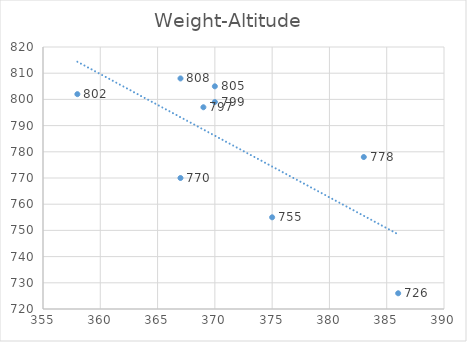
| Category | Series 0 |
|---|---|
| 383.0 | 778 |
| 369.0 | 797 |
| 370.0 | 799 |
| 370.0 | 805 |
| 375.0 | 755 |
| 367.0 | 808 |
| 367.0 | 770 |
| 386.0 | 726 |
| 358.0 | 802 |